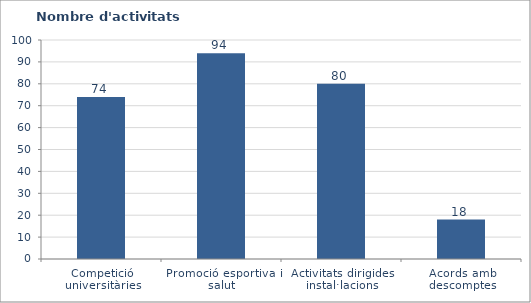
| Category | Nombre d'activitats ofertades |
|---|---|
| Competició universitàries | 74 |
| Promoció esportiva i salut | 94 |
| Activitats dirigides instal·lacions | 80 |
| Acords amb descomptes | 18 |